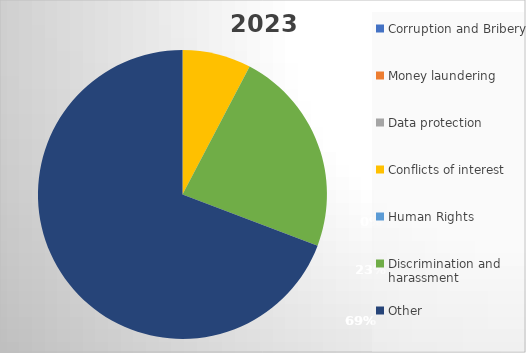
| Category | Corruption and Bribery |
|---|---|
| Corruption and Bribery | 0 |
| Money laundering | 0 |
| Data protection | 0 |
| Conflicts of interest | 1 |
| Human Rights | 0 |
| Discrimination and harassment | 3 |
| Other | 9 |